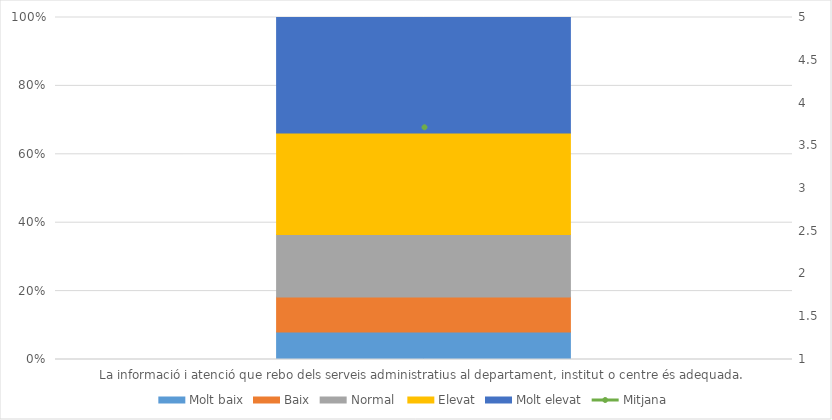
| Category | Molt baix | Baix | Normal  | Elevat | Molt elevat |
|---|---|---|---|---|---|
| La informació i atenció que rebo dels serveis administratius al departament, institut o centre és adequada. | 26 | 33 | 59 | 96 | 109 |